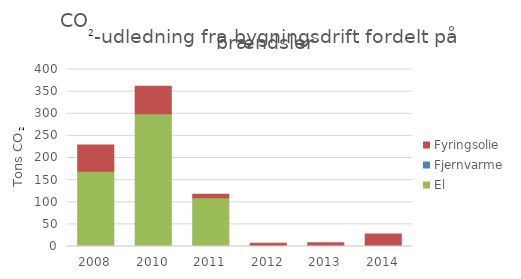
| Category | El | Fjernvarme | Fyringsolie |
|---|---|---|---|
| 2008.0 | 169.97 | 0 | 59.613 |
| 2010.0 | 299.972 | 0 | 62.35 |
| 2011.0 | 110.166 | 0 | 8.018 |
| 2012.0 | 0 | 0 | 7.511 |
| 2013.0 | 0 | 0 | 8.346 |
| 2014.0 | 0 | 0 | 28.259 |